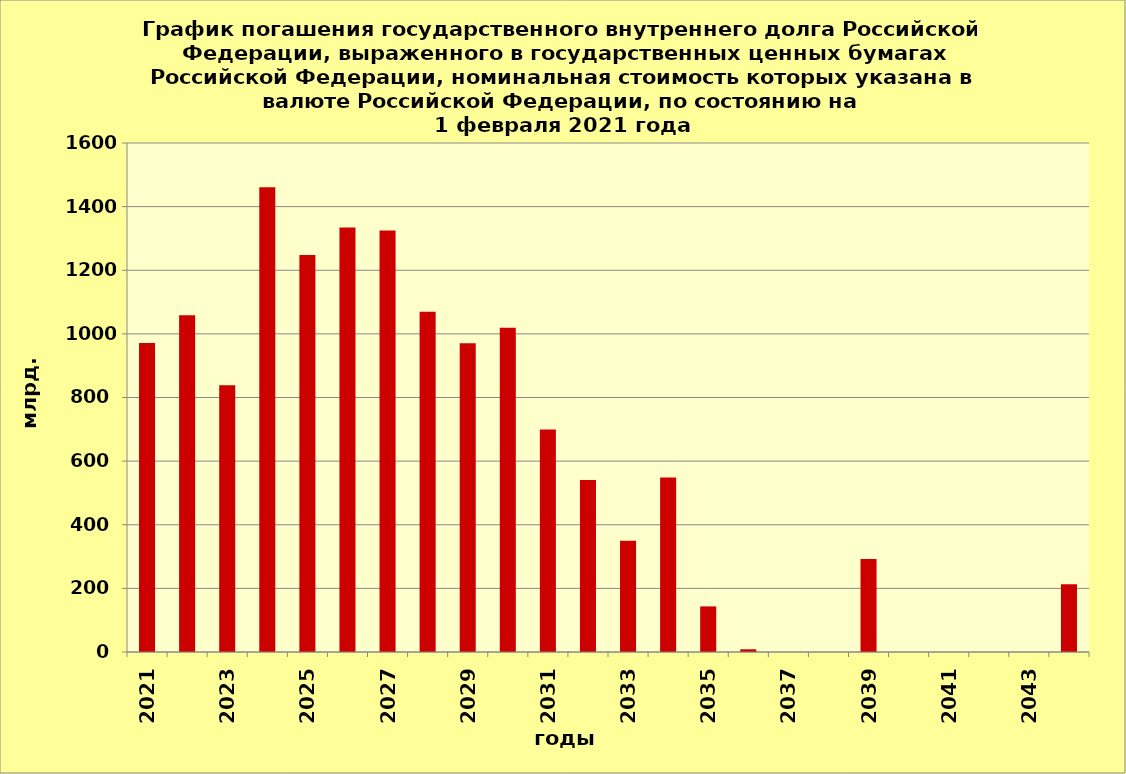
| Category | ряд 1 |
|---|---|
| 2021.0 | 971.639 |
| 2022.0 | 1058.437 |
| 2023.0 | 838.834 |
| 2024.0 | 1460.581 |
| 2025.0 | 1247.867 |
| 2026.0 | 1334.561 |
| 2027.0 | 1324.833 |
| 2028.0 | 1069.263 |
| 2029.0 | 970.488 |
| 2030.0 | 1019.194 |
| 2031.0 | 699.317 |
| 2032.0 | 540.894 |
| 2033.0 | 350 |
| 2034.0 | 548.84 |
| 2035.0 | 143.377 |
| 2036.0 | 8.553 |
| 2037.0 | 0 |
| 2038.0 | 0 |
| 2039.0 | 292.181 |
| 2040.0 | 0 |
| 2041.0 | 0 |
| 2042.0 | 0 |
| 2043.0 | 0 |
| 2044.0 | 212.636 |